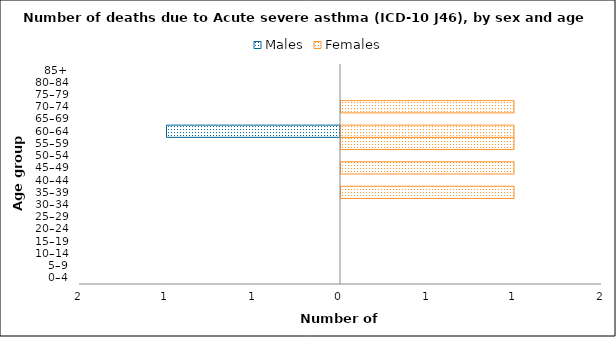
| Category | Males | Females |
|---|---|---|
| 0–4 | 0 | 0 |
| 5–9 | 0 | 0 |
| 10–14 | 0 | 0 |
| 15–19 | 0 | 0 |
| 20–24 | 0 | 0 |
| 25–29 | 0 | 0 |
| 30–34 | 0 | 0 |
| 35–39 | 0 | 1 |
| 40–44 | 0 | 0 |
| 45–49 | 0 | 1 |
| 50–54 | 0 | 0 |
| 55–59 | 0 | 1 |
| 60–64 | -1 | 1 |
| 65–69 | 0 | 0 |
| 70–74 | 0 | 1 |
| 75–79 | 0 | 0 |
| 80–84 | 0 | 0 |
| 85+ | 0 | 0 |